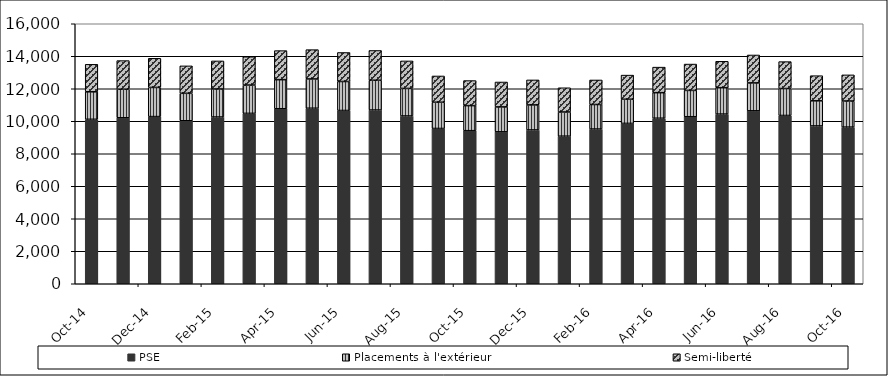
| Category | PSE | Placements à l'extérieur | Semi-liberté |
|---|---|---|---|
| 2014-10-01 | 10120 | 1692 | 1692 |
| 2014-11-01 | 10213 | 1760 | 1760 |
| 2014-12-01 | 10287 | 1794 | 1794 |
| 2015-01-01 | 10030 | 1689 | 1689 |
| 2015-02-01 | 10261 | 1726 | 1726 |
| 2015-03-01 | 10485 | 1742 | 1742 |
| 2015-04-01 | 10770 | 1789 | 1789 |
| 2015-05-01 | 10801 | 1803 | 1803 |
| 2015-06-01 | 10662 | 1785 | 1785 |
| 2015-07-01 | 10692 | 1832 | 1832 |
| 2015-08-01 | 10325 | 1694 | 1694 |
| 2015-09-01 | 9555 | 1616 | 1616 |
| 2015-10-01 | 9420 | 1542 | 1542 |
| 2015-11-01 | 9350 | 1533 | 1533 |
| 2015-12-01 | 9466 | 1539 | 1539 |
| 2016-01-01 | 9081 | 1490 | 1490 |
| 2016-02-01 | 9521 | 1510 | 1510 |
| 2016-03-01 | 9868 | 1486 | 1486 |
| 2016-04-01 | 10187 | 1572 | 1572 |
| 2016-05-01 | 10278 | 1621 | 1621 |
| 2016-06-01 | 10441 | 1625 | 1625 |
| 2016-07-01 | 10642 | 1718 | 1718 |
| 2016-08-01 | 10355 | 1658 | 1658 |
| 2016-09-01 | 9712 | 1546 | 1546 |
| 2016-10-01 | 9640 | 1607 | 1607 |